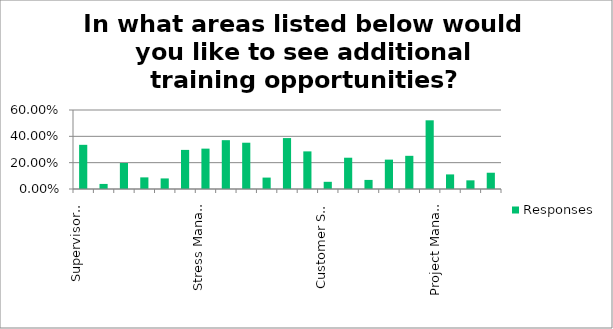
| Category | Responses |
|---|---|
| Supervisory Skills | 0.336 |
| Workplace Violence | 0.038 |
| Coronavirus (COVID-19) | 0.197 |
| Sexual Harassment | 0.088 |
| Compensation & Benefits | 0.08 |
| Cultural Diversity | 0.297 |
| Stress Management | 0.307 |
| Working with Difficult People | 0.371 |
| Working Remotely | 0.352 |
| Strategic Planning/Organizational Skills | 0.087 |
| Conflict Management | 0.387 |
| Workplace Ethics | 0.286 |
| Customer Service Skills | 0.055 |
| Employee Performance Management | 0.238 |
| Grievance Procedures | 0.069 |
| Managing Social Distaning in the Workplace | 0.223 |
| Organizational Skills | 0.252 |
| Using Technology or Technology in the Workplace(Microsoft 365, Zoom, Webex, Goto Meeting...) | 0.522 |
| Project Management Fundamentals | 0.111 |
| Developing Virtual Business Models | 0.066 |
| Teambuilding | 0.124 |